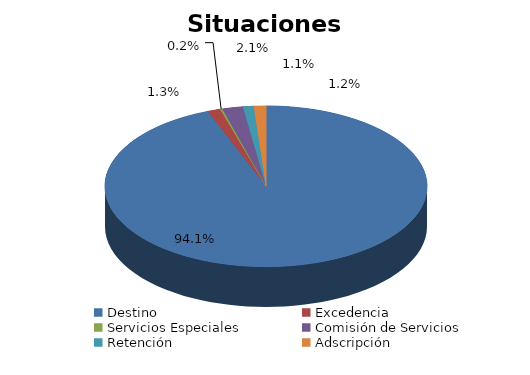
| Category | Series 0 |
|---|---|
| Destino | 2452 |
| Excedencia | 33 |
| Servicios Especiales | 6 |
| Comisión de Servicios | 54 |
| Retención | 28 |
| Adscripción | 32 |